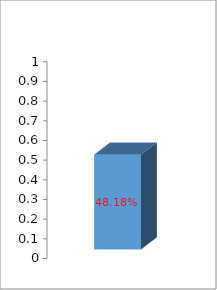
| Category | Series 0 |
|---|---|
| 0 | 0.482 |